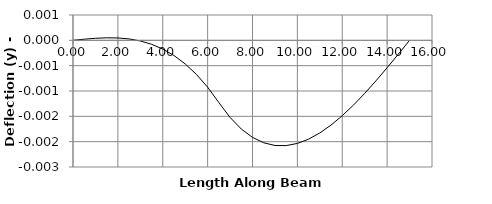
| Category | y |
|---|---|
| 0.0 | 0 |
| 0.5 | 0 |
| 1.0 | 0 |
| 1.5 | 0 |
| 2.0 | 0 |
| 2.5 | 0 |
| 3.0 | 0 |
| 3.5 | 0 |
| 4.0 | 0 |
| 4.5 | 0 |
| 5.0 | 0 |
| 5.5 | -0.001 |
| 6.0 | -0.001 |
| 6.49999 | -0.001 |
| 6.5 | -0.001 |
| 7.0 | -0.002 |
| 7.5 | -0.002 |
| 8.0 | -0.002 |
| 8.5 | -0.002 |
| 9.0 | -0.002 |
| 9.5 | -0.002 |
| 10.0 | -0.002 |
| 10.5 | -0.002 |
| 11.0 | -0.002 |
| 11.5 | -0.002 |
| 12.0 | -0.001 |
| 12.5 | -0.001 |
| 13.0 | -0.001 |
| 13.5 | -0.001 |
| 14.0 | -0.001 |
| 14.5 | 0 |
| 15.0 | 0 |
| 15.0 | 0 |